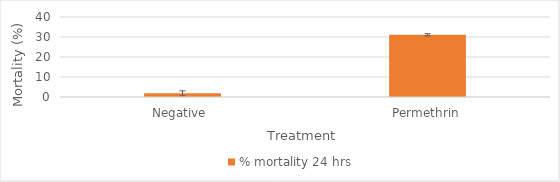
| Category | % mortality 24 hrs |
|---|---|
| Negative  | 1.818 |
| Permethrin | 31.068 |